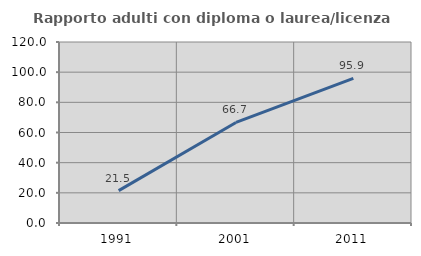
| Category | Rapporto adulti con diploma o laurea/licenza media  |
|---|---|
| 1991.0 | 21.459 |
| 2001.0 | 66.667 |
| 2011.0 | 95.909 |